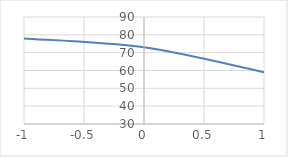
| Category | Series 0 |
|---|---|
| -1.0 | 78 |
| 0.0 | 73 |
| 1.0 | 59 |